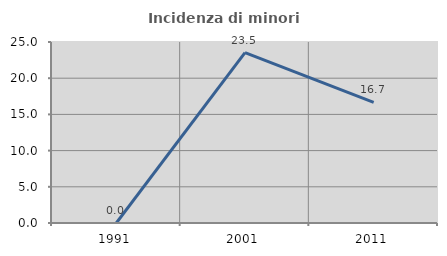
| Category | Incidenza di minori stranieri |
|---|---|
| 1991.0 | 0 |
| 2001.0 | 23.529 |
| 2011.0 | 16.667 |